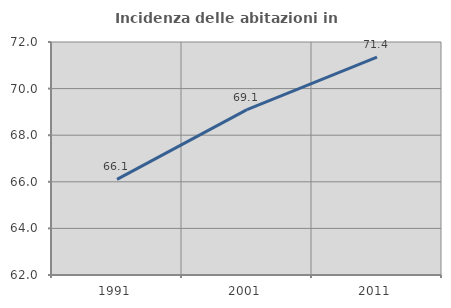
| Category | Incidenza delle abitazioni in proprietà  |
|---|---|
| 1991.0 | 66.102 |
| 2001.0 | 69.099 |
| 2011.0 | 71.353 |